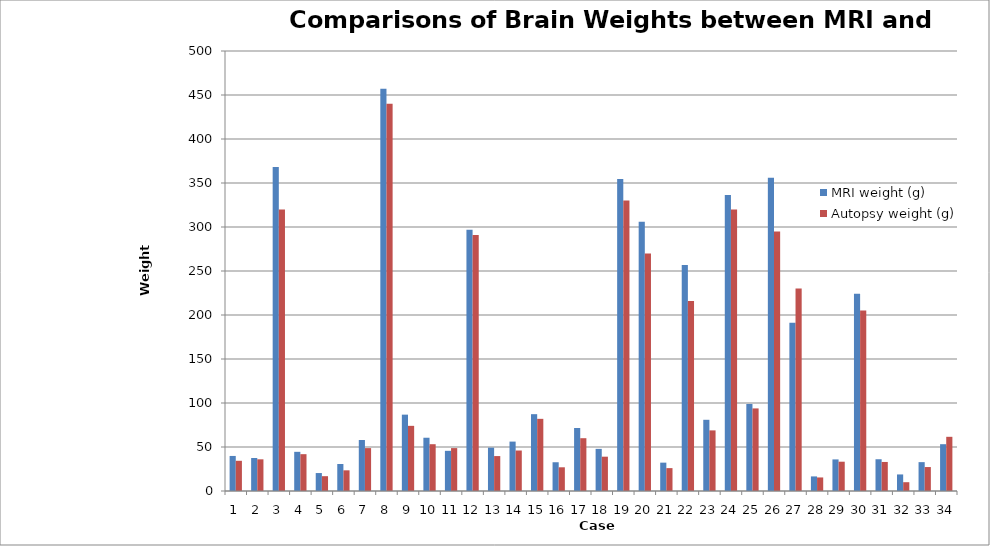
| Category | MRI weight (g) | Autopsy weight (g) |
|---|---|---|
| 0 | 39.83 | 34.32 |
| 1 | 37.49 | 36 |
| 2 | 368.14 | 320 |
| 3 | 44.51 | 41.85 |
| 4 | 20.4 | 16.84 |
| 5 | 30.69 | 23.5 |
| 6 | 57.94 | 48.75 |
| 7 | 457.02 | 440 |
| 8 | 86.77 | 74.04 |
| 9 | 60.53 | 53.18 |
| 10 | 45.65 | 48.76 |
| 11 | 296.74 | 291 |
| 12 | 49.25 | 39.69 |
| 13 | 56.14 | 46 |
| 14 | 87.31 | 82 |
| 15 | 32.67 | 26.94 |
| 16 | 71.6 | 60 |
| 17 | 47.87 | 39 |
| 18 | 354.42 | 330 |
| 19 | 306.09 | 270 |
| 20 | 32.22 | 26 |
| 21 | 256.82 | 216 |
| 22 | 80.91 | 68.88 |
| 23 | 336.29 | 320 |
| 24 | 98.91 | 93.85 |
| 25 | 356 | 295 |
| 26 | 191.1 | 230 |
| 27 | 16.58 | 15.4 |
| 28 | 35.9 | 33.29 |
| 29 | 224.11 | 205 |
| 30 | 36.08 | 33 |
| 31 | 18.82 | 10 |
| 32 | 32.8 | 27.22 |
| 33 | 53.19 | 61.58 |